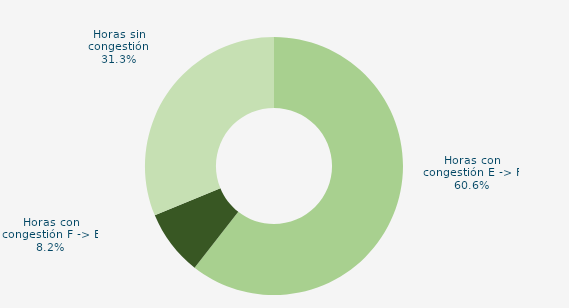
| Category | Horas con congestión E -> F |
|---|---|
| Horas con congestión E -> F | 60.556 |
| Horas con congestión F -> E | 8.194 |
| Horas sin congestión | 31.25 |